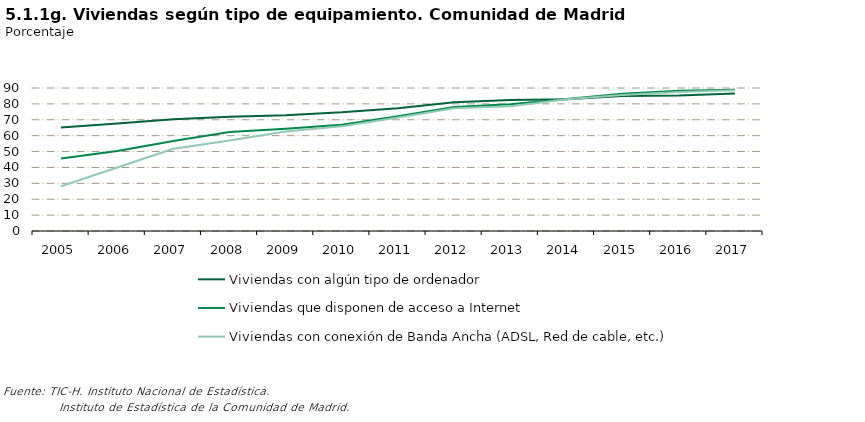
| Category | Viviendas con algún tipo de ordenador | Viviendas que disponen de acceso a Internet | Viviendas con conexión de Banda Ancha (ADSL, Red de cable, etc.) |
|---|---|---|---|
| 2005.0 | 65.142 | 45.66 | 28.12 |
| 2006.0 | 67.69 | 50.357 | 39.929 |
| 2007.0 | 70.359 | 56.617 | 51.737 |
| 2008.0 | 71.863 | 62.346 | 56.95 |
| 2009.0 | 72.841 | 64.335 | 62.642 |
| 2010.0 | 74.693 | 66.855 | 65.943 |
| 2011.0 | 77.33 | 72.244 | 71.423 |
| 2012.0 | 81.001 | 77.987 | 77.265 |
| 2013.0 | 82.509 | 79.822 | 78.451 |
| 2014.0 | 82.866 | 83.143 | 82.897 |
| 2015.0 | 84.91 | 86.371 | 85.653 |
| 2016.0 | 85.259 | 88.307 | 87.535 |
| 2017.0 | 86.517 | 88.918 | 88.543 |